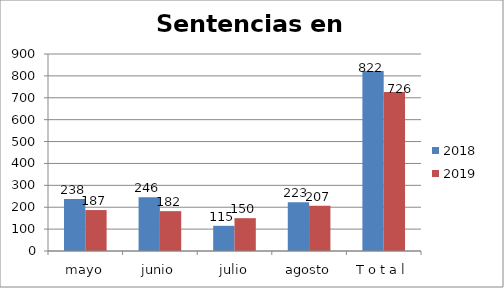
| Category | 2018 | 2019 |
|---|---|---|
| mayo | 238 | 187 |
| junio | 246 | 182 |
| julio | 115 | 150 |
| agosto | 223 | 207 |
| T o t a l | 822 | 726 |